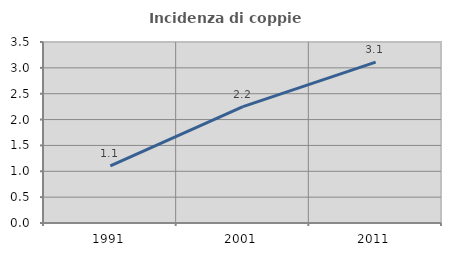
| Category | Incidenza di coppie miste |
|---|---|
| 1991.0 | 1.105 |
| 2001.0 | 2.249 |
| 2011.0 | 3.11 |